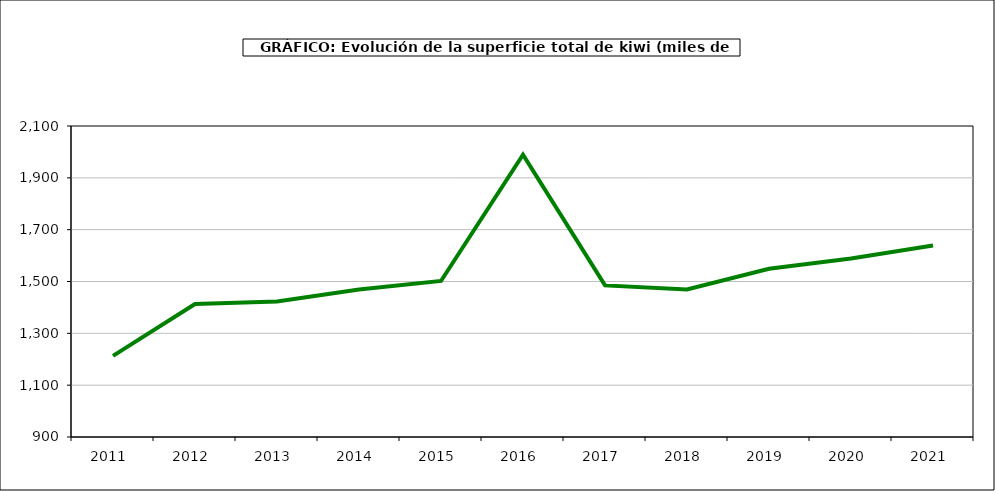
| Category | superficie kiwi |
|---|---|
| 2011.0 | 1213 |
| 2012.0 | 1413 |
| 2013.0 | 1423 |
| 2014.0 | 1469 |
| 2015.0 | 1502 |
| 2016.0 | 1989 |
| 2017.0 | 1485 |
| 2018.0 | 1469 |
| 2019.0 | 1549 |
| 2020.0 | 1589 |
| 2021.0 | 1639 |